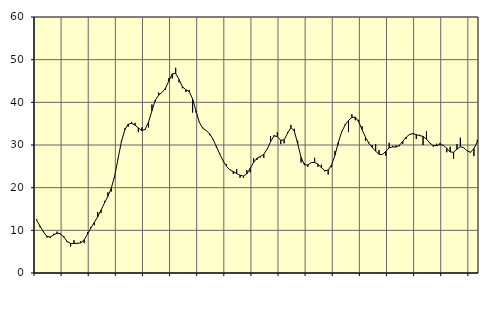
| Category | Piggar | Series 1 |
|---|---|---|
| nan | 12.6 | 12.34 |
| 87.0 | 10.7 | 10.99 |
| 87.0 | 9.8 | 9.62 |
| 87.0 | 8.3 | 8.6 |
| nan | 8.2 | 8.44 |
| 88.0 | 9.2 | 8.91 |
| 88.0 | 9.7 | 9.34 |
| 88.0 | 9.1 | 9.24 |
| nan | 8.7 | 8.41 |
| 89.0 | 7.2 | 7.41 |
| 89.0 | 6.2 | 6.91 |
| 89.0 | 7.7 | 6.91 |
| nan | 6.8 | 6.97 |
| 90.0 | 7.4 | 7.05 |
| 90.0 | 7 | 7.78 |
| 90.0 | 9.6 | 9.13 |
| nan | 10.8 | 10.58 |
| 91.0 | 11.2 | 11.87 |
| 91.0 | 14.3 | 13.16 |
| 91.0 | 14.1 | 14.77 |
| nan | 16.9 | 16.41 |
| 92.0 | 18.9 | 17.96 |
| 92.0 | 19.1 | 19.85 |
| 92.0 | 22.3 | 22.74 |
| nan | 26.7 | 26.79 |
| 93.0 | 31.1 | 30.8 |
| 93.0 | 33.9 | 33.57 |
| 93.0 | 34.3 | 34.88 |
| nan | 35.4 | 35.1 |
| 94.0 | 35.2 | 34.65 |
| 94.0 | 33 | 34 |
| 94.0 | 34.1 | 33.38 |
| nan | 33.5 | 33.66 |
| 95.0 | 34.1 | 35.36 |
| 95.0 | 39.5 | 38.02 |
| 95.0 | 40.2 | 40.53 |
| nan | 42.3 | 41.7 |
| 96.0 | 42.3 | 42.32 |
| 96.0 | 42.9 | 43.32 |
| 96.0 | 45.7 | 45.01 |
| nan | 45.6 | 46.67 |
| 97.0 | 48.1 | 46.8 |
| 97.0 | 44.7 | 45.34 |
| 97.0 | 43.3 | 43.65 |
| nan | 42.4 | 42.96 |
| 98.0 | 42.9 | 42.54 |
| 98.0 | 37.6 | 40.8 |
| 98.0 | 37.6 | 37.98 |
| nan | 35.4 | 35.29 |
| 99.0 | 34.1 | 33.92 |
| 99.0 | 33.4 | 33.38 |
| 99.0 | 32.3 | 32.67 |
| nan | 31.3 | 31.37 |
| 0.0 | 29.4 | 29.7 |
| 0.0 | 28.1 | 27.88 |
| 0.0 | 26.2 | 26.28 |
| nan | 25.5 | 24.98 |
| 1.0 | 24.3 | 24.17 |
| 1.0 | 23.2 | 23.75 |
| 1.0 | 24.3 | 23.31 |
| nan | 22.3 | 22.92 |
| 2.0 | 22.3 | 22.72 |
| 2.0 | 24.1 | 23.24 |
| 2.0 | 23.6 | 24.52 |
| nan | 26.9 | 25.93 |
| 3.0 | 26.5 | 26.91 |
| 3.0 | 27.1 | 27.3 |
| 3.0 | 27 | 27.82 |
| nan | 29 | 29.02 |
| 4.0 | 32.1 | 30.78 |
| 4.0 | 32.3 | 32.12 |
| 4.0 | 33 | 32 |
| nan | 30.2 | 31.09 |
| 5.0 | 30.4 | 31.21 |
| 5.0 | 33 | 32.73 |
| 5.0 | 34.7 | 34.08 |
| nan | 33.8 | 33.29 |
| 6.0 | 31 | 30.32 |
| 6.0 | 25.9 | 27.1 |
| 6.0 | 25.7 | 25.34 |
| nan | 24.9 | 25.33 |
| 7.0 | 25.9 | 25.88 |
| 7.0 | 27 | 25.92 |
| 7.0 | 24.9 | 25.5 |
| nan | 25.4 | 24.69 |
| 8.0 | 23.8 | 24.02 |
| 8.0 | 23.1 | 24.1 |
| 8.0 | 24.8 | 25.31 |
| nan | 28.6 | 27.6 |
| 9.0 | 30.1 | 30.63 |
| 9.0 | 33 | 33.09 |
| 9.0 | 34.9 | 34.67 |
| nan | 33 | 35.76 |
| 10.0 | 37.2 | 36.45 |
| 10.0 | 35.8 | 36.54 |
| 10.0 | 35.9 | 35.43 |
| nan | 34.4 | 33.62 |
| 11.0 | 31 | 31.84 |
| 11.0 | 30.6 | 30.4 |
| 11.0 | 30 | 29.43 |
| nan | 30.2 | 28.54 |
| 12.0 | 28.8 | 27.83 |
| 12.0 | 27.7 | 27.76 |
| 12.0 | 27.5 | 28.53 |
| nan | 30.5 | 29.32 |
| 13.0 | 29.8 | 29.55 |
| 13.0 | 29.9 | 29.53 |
| 13.0 | 29.7 | 29.92 |
| nan | 30.3 | 30.85 |
| 14.0 | 31.4 | 31.81 |
| 14.0 | 32.4 | 32.48 |
| 14.0 | 32.8 | 32.66 |
| nan | 31.4 | 32.43 |
| 15.0 | 32.4 | 32.2 |
| 15.0 | 30 | 32.02 |
| 15.0 | 33.2 | 31.38 |
| nan | 30.4 | 30.45 |
| 16.0 | 29.6 | 29.86 |
| 16.0 | 30.3 | 29.86 |
| 16.0 | 30.5 | 30.1 |
| nan | 30 | 29.93 |
| 17.0 | 28.3 | 29.22 |
| 17.0 | 29.6 | 28.37 |
| 17.0 | 26.8 | 28.29 |
| nan | 30.2 | 29.03 |
| 18.0 | 31.7 | 29.59 |
| 18.0 | 29.4 | 29.38 |
| 18.0 | 28.6 | 28.61 |
| nan | 28.2 | 28.32 |
| 19.0 | 27.4 | 29.16 |
| 19.0 | 31.2 | 30.71 |